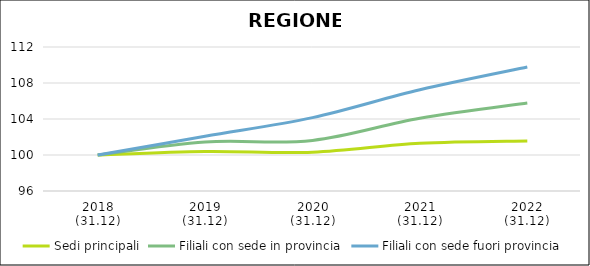
| Category | Sedi principali | Filiali con sede in provincia | Filiali con sede fuori provincia |
|---|---|---|---|
| 2018
(31.12) | 100 | 100 | 100 |
| 2019
(31.12) | 100.387 | 101.443 | 102.087 |
| 2020
(31.12) | 100.31 | 101.621 | 104.155 |
| 2021
(31.12) | 101.306 | 104.082 | 107.252 |
| 2022
(31.12) | 101.568 | 105.769 | 109.779 |